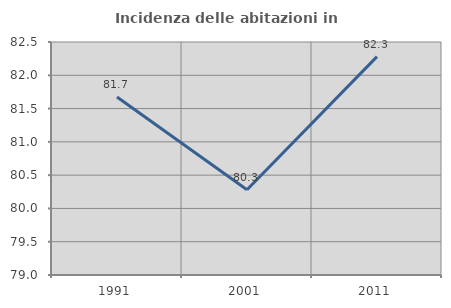
| Category | Incidenza delle abitazioni in proprietà  |
|---|---|
| 1991.0 | 81.673 |
| 2001.0 | 80.282 |
| 2011.0 | 82.281 |